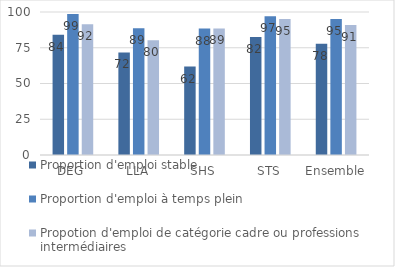
| Category | Proportion d'emploi stable | Proportion d'emploi à temps plein | Propotion d'emploi de catégorie cadre ou professions intermédiaires |
|---|---|---|---|
| DEG | 84.07 | 98.54 | 91.52 |
| LLA | 71.75 | 88.65 | 80.23 |
| SHS | 61.85 | 88.4 | 88.52 |
| STS | 82.46 | 97.05 | 95.18 |
| Ensemble | 77.85 | 95.12 | 90.93 |